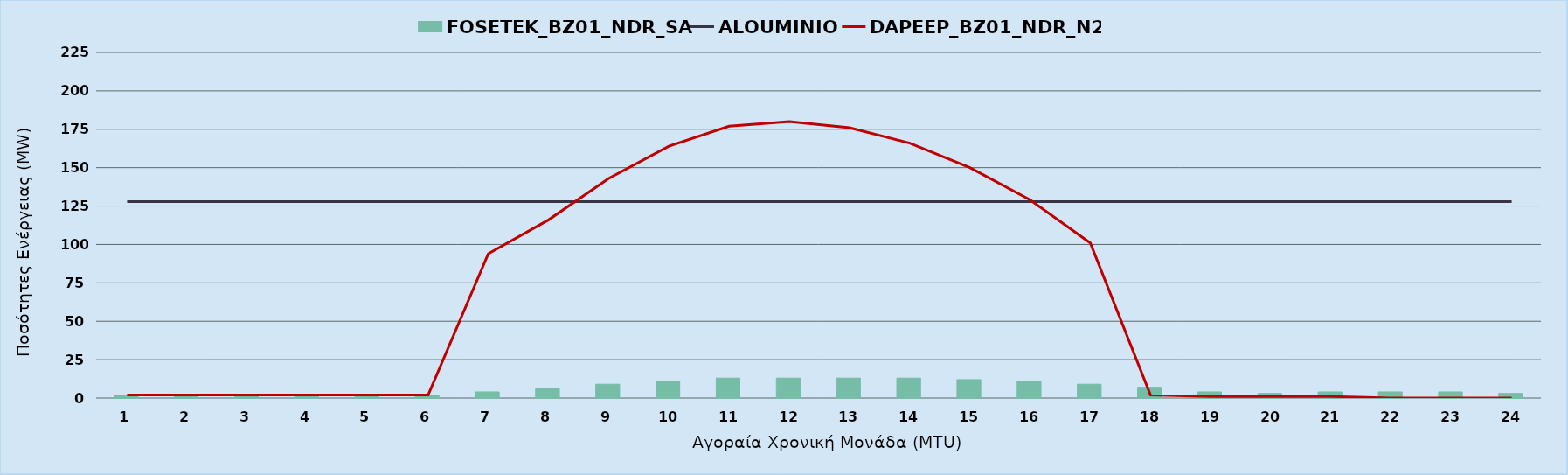
| Category | FOSETEK_BZ01_NDR_SA |
|---|---|
| 0 | 2 |
| 1 | 2 |
| 2 | 2 |
| 3 | 2 |
| 4 | 2 |
| 5 | 2 |
| 6 | 4 |
| 7 | 6 |
| 8 | 9 |
| 9 | 11 |
| 10 | 13 |
| 11 | 13 |
| 12 | 13 |
| 13 | 13 |
| 14 | 12 |
| 15 | 11 |
| 16 | 9 |
| 17 | 7 |
| 18 | 4 |
| 19 | 3 |
| 20 | 4 |
| 21 | 4 |
| 22 | 4 |
| 23 | 3 |